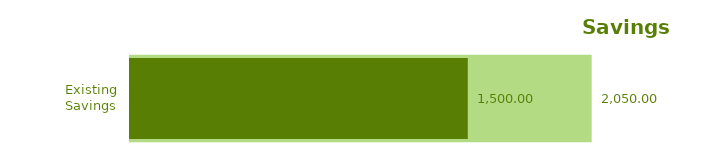
| Category | Series 0 |
|---|---|
| Existing Savings | 2050 |